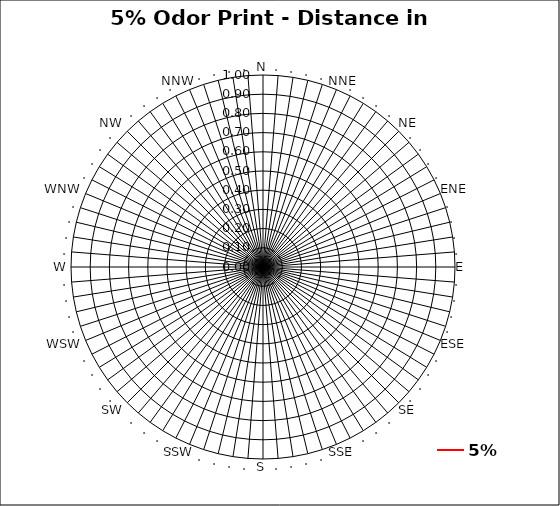
| Category | 5% |
|---|---|
| N | 0 |
| . | 0 |
| . | 0 |
| . | 0 |
| . | 0 |
| NNE | 0 |
| . | 0 |
| . | 0 |
| . | 0 |
| . | 0 |
| NE | 0 |
| . | 0 |
| . | 0 |
| . | 0 |
| . | 0 |
| ENE | 0 |
| . | 0 |
| . | 0 |
| . | 0 |
| . | 0 |
| E | 0 |
| . | 0 |
| . | 0 |
| . | 0 |
| . | 0 |
| ESE | 0 |
| . | 0 |
| . | 0 |
| . | 0 |
| . | 0 |
| SE | 0 |
| . | 0 |
| . | 0 |
| . | 0 |
| . | 0 |
| SSE | 0 |
| . | 0 |
| . | 0 |
| . | 0 |
| . | 0 |
| S | 0 |
| . | 0 |
| . | 0 |
| . | 0 |
| . | 0 |
| SSW | 0 |
| . | 0 |
| . | 0 |
| . | 0 |
| . | 0 |
| SW | 0 |
| . | 0 |
| . | 0 |
| . | 0 |
| . | 0 |
| WSW | 0 |
| . | 0 |
| . | 0 |
| . | 0 |
| . | 0 |
| W | 0 |
| . | 0 |
| . | 0 |
| . | 0 |
| . | 0 |
| WNW | 0 |
| . | 0 |
| . | 0 |
| . | 0 |
| . | 0 |
| NW | 0 |
| . | 0 |
| . | 0 |
| . | 0 |
| . | 0 |
| NNW | 0 |
| . | 0 |
| . | 0 |
| . | 0 |
| . | 0 |